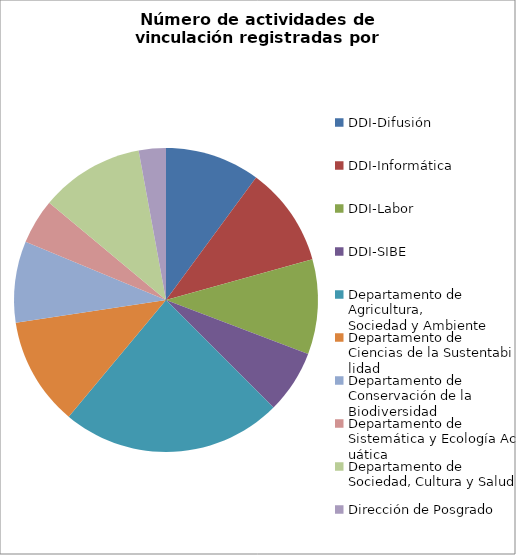
| Category | Número de actividades de vinculación |
|---|---|
| DDI-Difusión | 21 |
| DDI-Informática | 22 |
| DDI-Labor | 21 |
| DDI-SIBE | 14 |
| Departamento de Agricultura, Sociedad y Ambiente | 49 |
| Departamento de Ciencias de la Sustentabilidad | 24 |
| Departamento de Conservación de la Biodiversidad | 18 |
| Departamento de Sistemática y Ecología Acuática | 10 |
| Departamento de Sociedad, Cultura y Salud | 23 |
| Dirección de Posgrado | 6 |